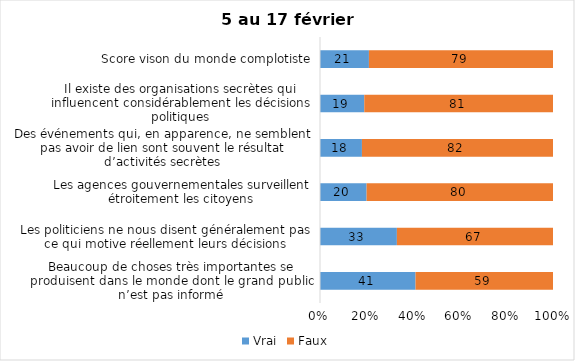
| Category | Vrai | Faux |
|---|---|---|
| Beaucoup de choses très importantes se produisent dans le monde dont le grand public n’est pas informé | 41 | 59 |
| Les politiciens ne nous disent généralement pas ce qui motive réellement leurs décisions | 33 | 67 |
| Les agences gouvernementales surveillent étroitement les citoyens | 20 | 80 |
| Des événements qui, en apparence, ne semblent pas avoir de lien sont souvent le résultat d’activités secrètes | 18 | 82 |
| Il existe des organisations secrètes qui influencent considérablement les décisions politiques | 19 | 81 |
| Score vison du monde complotiste | 21 | 79 |